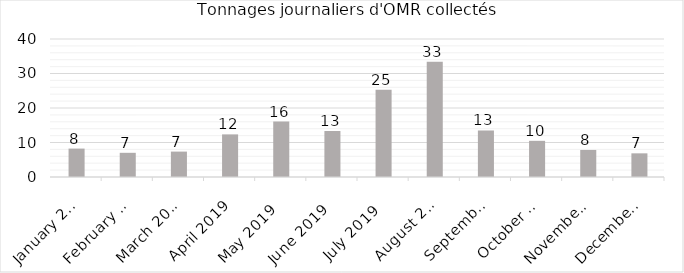
| Category | Tonnage journalier d'OMR |
|---|---|
| 2019-01-01 | 8.232 |
| 2019-02-01 | 7.011 |
| 2019-03-01 | 7.362 |
| 2019-04-01 | 12.352 |
| 2019-05-01 | 16.076 |
| 2019-06-01 | 13.33 |
| 2019-07-01 | 25.302 |
| 2019-08-01 | 33.39 |
| 2019-09-01 | 13.481 |
| 2019-10-01 | 10.484 |
| 2019-11-01 | 7.835 |
| 2019-12-01 | 6.858 |